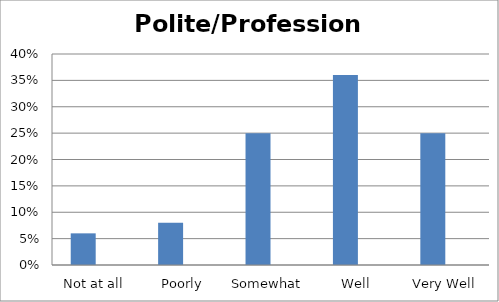
| Category | Series 0 | Series 1 |
|---|---|---|
| Not at all | 0.06 | 0 |
| Poorly | 0.08 | 0 |
| Somewhat  | 0.25 | 0 |
| Well | 0.36 | 0 |
| Very Well | 0.25 | 0 |